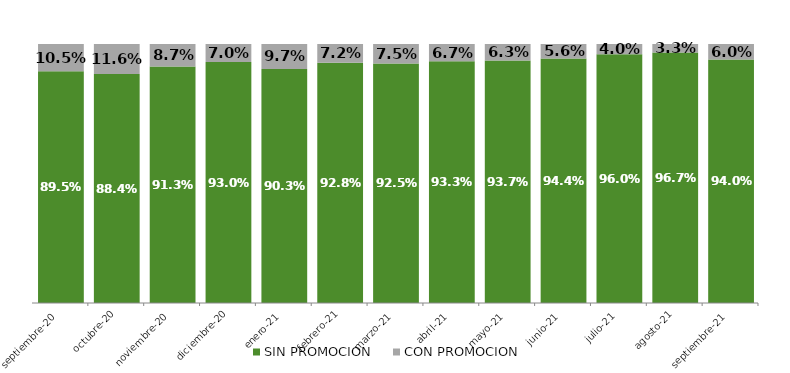
| Category | SIN PROMOCION   | CON PROMOCION   |
|---|---|---|
| 2020-09-01 | 0.895 | 0.105 |
| 2020-10-01 | 0.884 | 0.116 |
| 2020-11-01 | 0.913 | 0.087 |
| 2020-12-01 | 0.93 | 0.07 |
| 2021-01-01 | 0.903 | 0.097 |
| 2021-02-01 | 0.928 | 0.072 |
| 2021-03-01 | 0.925 | 0.075 |
| 2021-04-01 | 0.933 | 0.067 |
| 2021-05-01 | 0.937 | 0.063 |
| 2021-06-01 | 0.944 | 0.056 |
| 2021-07-01 | 0.96 | 0.04 |
| 2021-08-01 | 0.967 | 0.033 |
| 2021-09-01 | 0.94 | 0.06 |